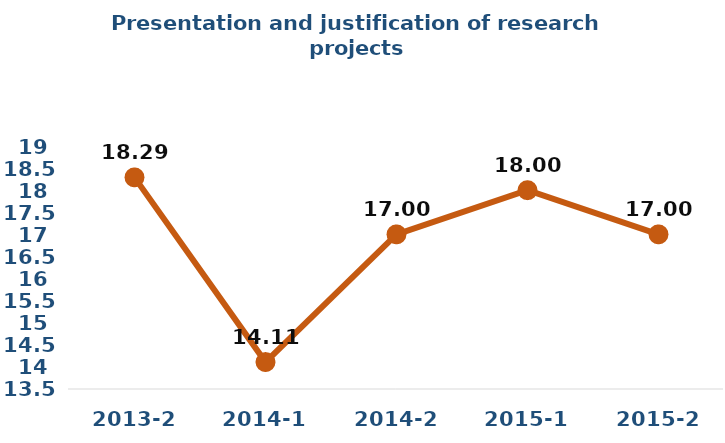
| Category | Series 0 |
|---|---|
| 2013-2 | 18.29 |
| 2014-1 | 14.11 |
| 2014-2 | 17 |
| 2015-1 | 18 |
| 2015-2 | 17 |